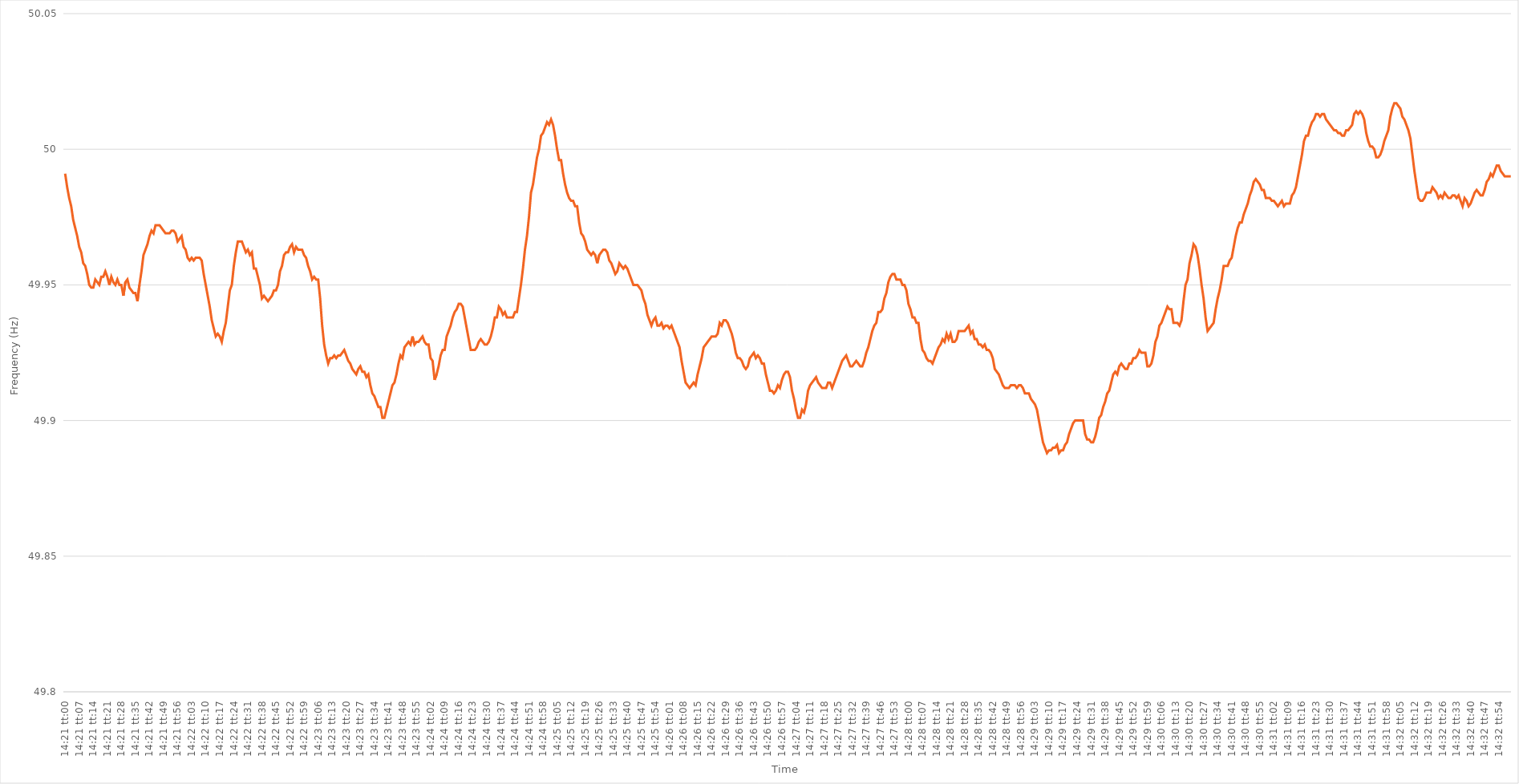
| Category | Series 0 |
|---|---|
| 0.5979166666666667 | 49.991 |
| 0.5979282407407408 | 49.986 |
| 0.5979398148148148 | 49.982 |
| 0.5979513888888889 | 49.979 |
| 0.5979629629629629 | 49.974 |
| 0.5979745370370371 | 49.971 |
| 0.5979861111111111 | 49.968 |
| 0.5979976851851853 | 49.964 |
| 0.5980092592592593 | 49.962 |
| 0.5980208333333333 | 49.958 |
| 0.5980324074074074 | 49.957 |
| 0.5980439814814814 | 49.954 |
| 0.5980555555555556 | 49.95 |
| 0.5980671296296296 | 49.949 |
| 0.5980787037037038 | 49.949 |
| 0.5980902777777778 | 49.952 |
| 0.5981018518518518 | 49.951 |
| 0.5981134259259259 | 49.95 |
| 0.598125 | 49.953 |
| 0.5981365740740741 | 49.953 |
| 0.5981481481481482 | 49.955 |
| 0.5981597222222222 | 49.953 |
| 0.5981712962962963 | 49.95 |
| 0.5981828703703703 | 49.953 |
| 0.5981944444444445 | 49.951 |
| 0.5982060185185185 | 49.95 |
| 0.5982175925925927 | 49.952 |
| 0.5982291666666667 | 49.95 |
| 0.5982407407407407 | 49.95 |
| 0.5982523148148148 | 49.946 |
| 0.5982638888888888 | 49.951 |
| 0.598275462962963 | 49.952 |
| 0.598287037037037 | 49.949 |
| 0.5982986111111112 | 49.948 |
| 0.5983101851851852 | 49.947 |
| 0.5983217592592592 | 49.947 |
| 0.5983333333333333 | 49.944 |
| 0.5983449074074074 | 49.95 |
| 0.5983564814814815 | 49.955 |
| 0.5983680555555556 | 49.961 |
| 0.5983796296296297 | 49.963 |
| 0.5983912037037037 | 49.965 |
| 0.5984027777777777 | 49.968 |
| 0.5984143518518519 | 49.97 |
| 0.5984259259259259 | 49.969 |
| 0.5984375000000001 | 49.972 |
| 0.5984490740740741 | 49.972 |
| 0.5984606481481481 | 49.972 |
| 0.5984722222222222 | 49.971 |
| 0.5984837962962963 | 49.97 |
| 0.5984953703703704 | 49.969 |
| 0.5985069444444444 | 49.969 |
| 0.5985185185185186 | 49.969 |
| 0.5985300925925926 | 49.97 |
| 0.5985416666666666 | 49.97 |
| 0.5985532407407407 | 49.969 |
| 0.5985648148148148 | 49.966 |
| 0.5985763888888889 | 49.967 |
| 0.598587962962963 | 49.968 |
| 0.598599537037037 | 49.964 |
| 0.5986111111111111 | 49.963 |
| 0.5986226851851851 | 49.96 |
| 0.5986342592592593 | 49.959 |
| 0.5986458333333333 | 49.96 |
| 0.5986574074074075 | 49.959 |
| 0.5986689814814815 | 49.96 |
| 0.5986805555555555 | 49.96 |
| 0.5986921296296296 | 49.96 |
| 0.5987037037037037 | 49.959 |
| 0.5987152777777778 | 49.954 |
| 0.5987268518518518 | 49.95 |
| 0.598738425925926 | 49.946 |
| 0.59875 | 49.942 |
| 0.598761574074074 | 49.937 |
| 0.5987731481481481 | 49.934 |
| 0.5987847222222222 | 49.931 |
| 0.5987962962962963 | 49.932 |
| 0.5988078703703704 | 49.931 |
| 0.5988194444444445 | 49.929 |
| 0.5988310185185185 | 49.933 |
| 0.5988425925925925 | 49.936 |
| 0.5988541666666667 | 49.942 |
| 0.5988657407407407 | 49.948 |
| 0.5988773148148149 | 49.95 |
| 0.5988888888888889 | 49.957 |
| 0.598900462962963 | 49.962 |
| 0.598912037037037 | 49.966 |
| 0.5989236111111111 | 49.966 |
| 0.5989351851851852 | 49.966 |
| 0.5989467592592593 | 49.964 |
| 0.5989583333333334 | 49.962 |
| 0.5989699074074074 | 49.963 |
| 0.5989814814814814 | 49.961 |
| 0.5989930555555555 | 49.962 |
| 0.5990046296296296 | 49.956 |
| 0.5990162037037037 | 49.956 |
| 0.5990277777777778 | 49.953 |
| 0.5990393518518519 | 49.95 |
| 0.5990509259259259 | 49.945 |
| 0.5990624999999999 | 49.946 |
| 0.5990740740740741 | 49.945 |
| 0.5990856481481481 | 49.944 |
| 0.5990972222222223 | 49.945 |
| 0.5991087962962963 | 49.946 |
| 0.5991203703703704 | 49.948 |
| 0.5991319444444444 | 49.948 |
| 0.5991435185185185 | 49.95 |
| 0.5991550925925926 | 49.955 |
| 0.5991666666666667 | 49.957 |
| 0.5991782407407408 | 49.961 |
| 0.5991898148148148 | 49.962 |
| 0.5992013888888889 | 49.962 |
| 0.5992129629629629 | 49.964 |
| 0.599224537037037 | 49.965 |
| 0.5992361111111111 | 49.962 |
| 0.5992476851851852 | 49.964 |
| 0.5992592592592593 | 49.963 |
| 0.5992708333333333 | 49.963 |
| 0.5992824074074073 | 49.963 |
| 0.5992939814814815 | 49.961 |
| 0.5993055555555555 | 49.96 |
| 0.5993171296296297 | 49.957 |
| 0.5993287037037037 | 49.955 |
| 0.5993402777777778 | 49.952 |
| 0.5993518518518518 | 49.953 |
| 0.599363425925926 | 49.952 |
| 0.599375 | 49.952 |
| 0.5993865740740741 | 49.945 |
| 0.5993981481481482 | 49.935 |
| 0.5994097222222222 | 49.928 |
| 0.5994212962962963 | 49.924 |
| 0.5994328703703703 | 49.921 |
| 0.5994444444444444 | 49.923 |
| 0.5994560185185185 | 49.923 |
| 0.5994675925925926 | 49.924 |
| 0.5994791666666667 | 49.923 |
| 0.5994907407407407 | 49.924 |
| 0.5995023148148148 | 49.924 |
| 0.5995138888888889 | 49.925 |
| 0.5995254629629629 | 49.926 |
| 0.5995370370370371 | 49.924 |
| 0.5995486111111111 | 49.922 |
| 0.5995601851851852 | 49.921 |
| 0.5995717592592592 | 49.919 |
| 0.5995833333333334 | 49.918 |
| 0.5995949074074074 | 49.917 |
| 0.5996064814814815 | 49.919 |
| 0.5996180555555556 | 49.92 |
| 0.5996296296296296 | 49.918 |
| 0.5996412037037037 | 49.918 |
| 0.5996527777777778 | 49.916 |
| 0.5996643518518519 | 49.917 |
| 0.599675925925926 | 49.913 |
| 0.5996875 | 49.91 |
| 0.5996990740740741 | 49.909 |
| 0.5997106481481481 | 49.907 |
| 0.5997222222222222 | 49.905 |
| 0.5997337962962963 | 49.905 |
| 0.5997453703703703 | 49.901 |
| 0.5997569444444445 | 49.901 |
| 0.5997685185185185 | 49.904 |
| 0.5997800925925926 | 49.907 |
| 0.5997916666666666 | 49.91 |
| 0.5998032407407408 | 49.913 |
| 0.5998148148148148 | 49.914 |
| 0.599826388888889 | 49.917 |
| 0.599837962962963 | 49.921 |
| 0.599849537037037 | 49.924 |
| 0.5998611111111111 | 49.923 |
| 0.5998726851851852 | 49.927 |
| 0.5998842592592593 | 49.928 |
| 0.5998958333333334 | 49.929 |
| 0.5999074074074074 | 49.928 |
| 0.5999189814814815 | 49.931 |
| 0.5999305555555555 | 49.928 |
| 0.5999421296296296 | 49.929 |
| 0.5999537037037037 | 49.929 |
| 0.5999652777777778 | 49.93 |
| 0.5999768518518519 | 49.931 |
| 0.5999884259259259 | 49.929 |
| 0.6 | 49.928 |
| 0.600011574074074 | 49.928 |
| 0.6000231481481482 | 49.923 |
| 0.6000347222222222 | 49.922 |
| 0.6000462962962964 | 49.915 |
| 0.6000578703703704 | 49.917 |
| 0.6000694444444444 | 49.92 |
| 0.6000810185185185 | 49.924 |
| 0.6000925925925926 | 49.926 |
| 0.6001041666666667 | 49.926 |
| 0.6001157407407408 | 49.931 |
| 0.6001273148148148 | 49.933 |
| 0.6001388888888889 | 49.935 |
| 0.6001504629629629 | 49.938 |
| 0.600162037037037 | 49.94 |
| 0.6001736111111111 | 49.941 |
| 0.6001851851851852 | 49.943 |
| 0.6001967592592593 | 49.943 |
| 0.6002083333333333 | 49.942 |
| 0.6002199074074074 | 49.938 |
| 0.6002314814814814 | 49.934 |
| 0.6002430555555556 | 49.93 |
| 0.6002546296296296 | 49.926 |
| 0.6002662037037038 | 49.926 |
| 0.6002777777777778 | 49.926 |
| 0.6002893518518518 | 49.927 |
| 0.6003009259259259 | 49.929 |
| 0.6003125 | 49.93 |
| 0.6003240740740741 | 49.929 |
| 0.6003356481481482 | 49.928 |
| 0.6003472222222223 | 49.928 |
| 0.6003587962962963 | 49.929 |
| 0.6003703703703703 | 49.931 |
| 0.6003819444444445 | 49.934 |
| 0.6003935185185185 | 49.938 |
| 0.6004050925925926 | 49.938 |
| 0.6004166666666667 | 49.942 |
| 0.6004282407407407 | 49.941 |
| 0.6004398148148148 | 49.939 |
| 0.6004513888888888 | 49.94 |
| 0.600462962962963 | 49.938 |
| 0.600474537037037 | 49.938 |
| 0.6004861111111112 | 49.938 |
| 0.6004976851851852 | 49.938 |
| 0.6005092592592592 | 49.94 |
| 0.6005208333333333 | 49.94 |
| 0.6005324074074074 | 49.945 |
| 0.6005439814814815 | 49.95 |
| 0.6005555555555556 | 49.956 |
| 0.6005671296296297 | 49.963 |
| 0.6005787037037037 | 49.968 |
| 0.6005902777777777 | 49.975 |
| 0.6006018518518519 | 49.984 |
| 0.6006134259259259 | 49.987 |
| 0.600625 | 49.992 |
| 0.6006365740740741 | 49.997 |
| 0.6006481481481482 | 50 |
| 0.6006597222222222 | 50.005 |
| 0.6006712962962962 | 50.006 |
| 0.6006828703703704 | 50.008 |
| 0.6006944444444444 | 50.01 |
| 0.6007060185185186 | 50.009 |
| 0.6007175925925926 | 50.011 |
| 0.6007291666666666 | 50.009 |
| 0.6007407407407407 | 50.005 |
| 0.6007523148148148 | 50 |
| 0.6007638888888889 | 49.996 |
| 0.600775462962963 | 49.996 |
| 0.6007870370370371 | 49.991 |
| 0.6007986111111111 | 49.987 |
| 0.6008101851851851 | 49.984 |
| 0.6008217592592593 | 49.982 |
| 0.6008333333333333 | 49.981 |
| 0.6008449074074074 | 49.981 |
| 0.6008564814814815 | 49.979 |
| 0.6008680555555556 | 49.979 |
| 0.6008796296296296 | 49.973 |
| 0.6008912037037036 | 49.969 |
| 0.6009027777777778 | 49.968 |
| 0.6009143518518518 | 49.966 |
| 0.600925925925926 | 49.963 |
| 0.6009375 | 49.962 |
| 0.600949074074074 | 49.961 |
| 0.6009606481481481 | 49.962 |
| 0.6009722222222222 | 49.961 |
| 0.6009837962962963 | 49.958 |
| 0.6009953703703704 | 49.961 |
| 0.6010069444444445 | 49.962 |
| 0.6010185185185185 | 49.963 |
| 0.6010300925925925 | 49.963 |
| 0.6010416666666667 | 49.962 |
| 0.6010532407407407 | 49.959 |
| 0.6010648148148149 | 49.958 |
| 0.6010763888888889 | 49.956 |
| 0.601087962962963 | 49.954 |
| 0.601099537037037 | 49.955 |
| 0.601111111111111 | 49.958 |
| 0.6011226851851852 | 49.957 |
| 0.6011342592592592 | 49.956 |
| 0.6011458333333334 | 49.957 |
| 0.6011574074074074 | 49.956 |
| 0.6011689814814815 | 49.954 |
| 0.6011805555555555 | 49.952 |
| 0.6011921296296296 | 49.95 |
| 0.6012037037037037 | 49.95 |
| 0.6012152777777778 | 49.95 |
| 0.6012268518518519 | 49.949 |
| 0.6012384259259259 | 49.948 |
| 0.60125 | 49.945 |
| 0.6012615740740741 | 49.943 |
| 0.6012731481481481 | 49.939 |
| 0.6012847222222223 | 49.937 |
| 0.6012962962962963 | 49.935 |
| 0.6013078703703704 | 49.937 |
| 0.6013194444444444 | 49.938 |
| 0.6013310185185184 | 49.935 |
| 0.6013425925925926 | 49.935 |
| 0.6013541666666666 | 49.936 |
| 0.6013657407407408 | 49.934 |
| 0.6013773148148148 | 49.935 |
| 0.6013888888888889 | 49.935 |
| 0.6014004629629629 | 49.934 |
| 0.601412037037037 | 49.935 |
| 0.6014236111111111 | 49.933 |
| 0.6014351851851852 | 49.931 |
| 0.6014467592592593 | 49.929 |
| 0.6014583333333333 | 49.927 |
| 0.6014699074074074 | 49.922 |
| 0.6014814814814815 | 49.918 |
| 0.6014930555555555 | 49.914 |
| 0.6015046296296297 | 49.913 |
| 0.6015162037037037 | 49.912 |
| 0.6015277777777778 | 49.913 |
| 0.6015393518518518 | 49.914 |
| 0.601550925925926 | 49.913 |
| 0.6015625 | 49.917 |
| 0.601574074074074 | 49.92 |
| 0.6015856481481482 | 49.923 |
| 0.6015972222222222 | 49.927 |
| 0.6016087962962963 | 49.928 |
| 0.6016203703703703 | 49.929 |
| 0.6016319444444445 | 49.93 |
| 0.6016435185185185 | 49.931 |
| 0.6016550925925926 | 49.931 |
| 0.6016666666666667 | 49.931 |
| 0.6016782407407407 | 49.932 |
| 0.6016898148148148 | 49.936 |
| 0.6017013888888889 | 49.935 |
| 0.601712962962963 | 49.937 |
| 0.6017245370370371 | 49.937 |
| 0.6017361111111111 | 49.936 |
| 0.6017476851851852 | 49.934 |
| 0.6017592592592592 | 49.932 |
| 0.6017708333333334 | 49.929 |
| 0.6017824074074074 | 49.925 |
| 0.6017939814814816 | 49.923 |
| 0.6018055555555556 | 49.923 |
| 0.6018171296296296 | 49.922 |
| 0.6018287037037037 | 49.92 |
| 0.6018402777777777 | 49.919 |
| 0.6018518518518519 | 49.92 |
| 0.6018634259259259 | 49.923 |
| 0.601875 | 49.924 |
| 0.6018865740740741 | 49.925 |
| 0.6018981481481481 | 49.923 |
| 0.6019097222222222 | 49.924 |
| 0.6019212962962963 | 49.923 |
| 0.6019328703703704 | 49.921 |
| 0.6019444444444445 | 49.921 |
| 0.6019560185185185 | 49.917 |
| 0.6019675925925926 | 49.914 |
| 0.6019791666666666 | 49.911 |
| 0.6019907407407408 | 49.911 |
| 0.6020023148148148 | 49.91 |
| 0.602013888888889 | 49.911 |
| 0.602025462962963 | 49.913 |
| 0.602037037037037 | 49.912 |
| 0.6020486111111111 | 49.915 |
| 0.6020601851851851 | 49.917 |
| 0.6020717592592593 | 49.918 |
| 0.6020833333333333 | 49.918 |
| 0.6020949074074075 | 49.916 |
| 0.6021064814814815 | 49.911 |
| 0.6021180555555555 | 49.908 |
| 0.6021296296296296 | 49.904 |
| 0.6021412037037037 | 49.901 |
| 0.6021527777777778 | 49.901 |
| 0.6021643518518519 | 49.904 |
| 0.602175925925926 | 49.903 |
| 0.6021875 | 49.906 |
| 0.602199074074074 | 49.911 |
| 0.6022106481481482 | 49.913 |
| 0.6022222222222222 | 49.914 |
| 0.6022337962962964 | 49.915 |
| 0.6022453703703704 | 49.916 |
| 0.6022569444444444 | 49.914 |
| 0.6022685185185185 | 49.913 |
| 0.6022800925925926 | 49.912 |
| 0.6022916666666667 | 49.912 |
| 0.6023032407407407 | 49.912 |
| 0.6023148148148149 | 49.914 |
| 0.6023263888888889 | 49.914 |
| 0.6023379629629629 | 49.912 |
| 0.602349537037037 | 49.914 |
| 0.6023611111111111 | 49.916 |
| 0.6023726851851852 | 49.918 |
| 0.6023842592592593 | 49.92 |
| 0.6023958333333334 | 49.922 |
| 0.6024074074074074 | 49.923 |
| 0.6024189814814814 | 49.924 |
| 0.6024305555555556 | 49.922 |
| 0.6024421296296296 | 49.92 |
| 0.6024537037037038 | 49.92 |
| 0.6024652777777778 | 49.921 |
| 0.6024768518518518 | 49.922 |
| 0.6024884259259259 | 49.921 |
| 0.6025 | 49.92 |
| 0.6025115740740741 | 49.92 |
| 0.6025231481481481 | 49.922 |
| 0.6025347222222223 | 49.925 |
| 0.6025462962962963 | 49.927 |
| 0.6025578703703703 | 49.93 |
| 0.6025694444444444 | 49.933 |
| 0.6025810185185185 | 49.935 |
| 0.6025925925925926 | 49.936 |
| 0.6026041666666667 | 49.94 |
| 0.6026157407407408 | 49.94 |
| 0.6026273148148148 | 49.941 |
| 0.6026388888888888 | 49.945 |
| 0.602650462962963 | 49.947 |
| 0.602662037037037 | 49.951 |
| 0.6026736111111112 | 49.953 |
| 0.6026851851851852 | 49.954 |
| 0.6026967592592593 | 49.954 |
| 0.6027083333333333 | 49.952 |
| 0.6027199074074074 | 49.952 |
| 0.6027314814814815 | 49.952 |
| 0.6027430555555555 | 49.95 |
| 0.6027546296296297 | 49.95 |
| 0.6027662037037037 | 49.948 |
| 0.6027777777777777 | 49.943 |
| 0.6027893518518518 | 49.941 |
| 0.6028009259259259 | 49.938 |
| 0.6028125 | 49.938 |
| 0.6028240740740741 | 49.936 |
| 0.6028356481481482 | 49.936 |
| 0.6028472222222222 | 49.93 |
| 0.6028587962962962 | 49.926 |
| 0.6028703703703704 | 49.925 |
| 0.6028819444444444 | 49.923 |
| 0.6028935185185186 | 49.922 |
| 0.6029050925925926 | 49.922 |
| 0.6029166666666667 | 49.921 |
| 0.6029282407407407 | 49.923 |
| 0.6029398148148148 | 49.925 |
| 0.6029513888888889 | 49.927 |
| 0.602962962962963 | 49.928 |
| 0.6029745370370371 | 49.93 |
| 0.6029861111111111 | 49.929 |
| 0.6029976851851852 | 49.932 |
| 0.6030092592592592 | 49.93 |
| 0.6030208333333333 | 49.932 |
| 0.6030324074074074 | 49.929 |
| 0.6030439814814815 | 49.929 |
| 0.6030555555555556 | 49.93 |
| 0.6030671296296296 | 49.933 |
| 0.6030787037037036 | 49.933 |
| 0.6030902777777778 | 49.933 |
| 0.6031018518518518 | 49.933 |
| 0.603113425925926 | 49.934 |
| 0.603125 | 49.935 |
| 0.6031365740740741 | 49.932 |
| 0.6031481481481481 | 49.933 |
| 0.6031597222222222 | 49.93 |
| 0.6031712962962963 | 49.93 |
| 0.6031828703703704 | 49.928 |
| 0.6031944444444445 | 49.928 |
| 0.6032060185185185 | 49.927 |
| 0.6032175925925926 | 49.928 |
| 0.6032291666666666 | 49.926 |
| 0.6032407407407407 | 49.926 |
| 0.6032523148148148 | 49.925 |
| 0.6032638888888889 | 49.923 |
| 0.603275462962963 | 49.919 |
| 0.603287037037037 | 49.918 |
| 0.603298611111111 | 49.917 |
| 0.6033101851851852 | 49.915 |
| 0.6033217592592592 | 49.913 |
| 0.6033333333333334 | 49.912 |
| 0.6033449074074074 | 49.912 |
| 0.6033564814814815 | 49.912 |
| 0.6033680555555555 | 49.913 |
| 0.6033796296296297 | 49.913 |
| 0.6033912037037037 | 49.913 |
| 0.6034027777777778 | 49.912 |
| 0.6034143518518519 | 49.913 |
| 0.6034259259259259 | 49.913 |
| 0.6034375 | 49.912 |
| 0.603449074074074 | 49.91 |
| 0.6034606481481481 | 49.91 |
| 0.6034722222222222 | 49.91 |
| 0.6034837962962963 | 49.908 |
| 0.6034953703703704 | 49.907 |
| 0.6035069444444444 | 49.906 |
| 0.6035185185185185 | 49.904 |
| 0.6035300925925926 | 49.9 |
| 0.6035416666666666 | 49.896 |
| 0.6035532407407408 | 49.892 |
| 0.6035648148148148 | 49.89 |
| 0.6035763888888889 | 49.888 |
| 0.6035879629629629 | 49.889 |
| 0.6035995370370371 | 49.889 |
| 0.6036111111111111 | 49.89 |
| 0.6036226851851852 | 49.89 |
| 0.6036342592592593 | 49.891 |
| 0.6036458333333333 | 49.888 |
| 0.6036574074074074 | 49.889 |
| 0.6036689814814815 | 49.889 |
| 0.6036805555555556 | 49.891 |
| 0.6036921296296297 | 49.892 |
| 0.6037037037037037 | 49.895 |
| 0.6037152777777778 | 49.897 |
| 0.6037268518518518 | 49.899 |
| 0.6037384259259259 | 49.9 |
| 0.60375 | 49.9 |
| 0.603761574074074 | 49.9 |
| 0.6037731481481482 | 49.9 |
| 0.6037847222222222 | 49.9 |
| 0.6037962962962963 | 49.895 |
| 0.6038078703703703 | 49.893 |
| 0.6038194444444445 | 49.893 |
| 0.6038310185185185 | 49.892 |
| 0.6038425925925927 | 49.892 |
| 0.6038541666666667 | 49.894 |
| 0.6038657407407407 | 49.897 |
| 0.6038773148148148 | 49.901 |
| 0.6038888888888889 | 49.902 |
| 0.603900462962963 | 49.905 |
| 0.6039120370370371 | 49.907 |
| 0.6039236111111111 | 49.91 |
| 0.6039351851851852 | 49.911 |
| 0.6039467592592592 | 49.914 |
| 0.6039583333333333 | 49.917 |
| 0.6039699074074074 | 49.918 |
| 0.6039814814814815 | 49.917 |
| 0.6039930555555556 | 49.92 |
| 0.6040046296296296 | 49.921 |
| 0.6040162037037037 | 49.92 |
| 0.6040277777777777 | 49.919 |
| 0.6040393518518519 | 49.919 |
| 0.6040509259259259 | 49.921 |
| 0.6040625000000001 | 49.921 |
| 0.6040740740740741 | 49.923 |
| 0.6040856481481481 | 49.923 |
| 0.6040972222222222 | 49.924 |
| 0.6041087962962963 | 49.926 |
| 0.6041203703703704 | 49.925 |
| 0.6041319444444445 | 49.925 |
| 0.6041435185185186 | 49.925 |
| 0.6041550925925926 | 49.92 |
| 0.6041666666666666 | 49.92 |
| 0.6041782407407407 | 49.921 |
| 0.6041898148148148 | 49.924 |
| 0.6042013888888889 | 49.929 |
| 0.604212962962963 | 49.931 |
| 0.604224537037037 | 49.935 |
| 0.6042361111111111 | 49.936 |
| 0.6042476851851851 | 49.938 |
| 0.6042592592592593 | 49.94 |
| 0.6042708333333333 | 49.942 |
| 0.6042824074074075 | 49.941 |
| 0.6042939814814815 | 49.941 |
| 0.6043055555555555 | 49.936 |
| 0.6043171296296296 | 49.936 |
| 0.6043287037037037 | 49.936 |
| 0.6043402777777778 | 49.935 |
| 0.6043518518518519 | 49.937 |
| 0.604363425925926 | 49.944 |
| 0.604375 | 49.95 |
| 0.604386574074074 | 49.952 |
| 0.6043981481481482 | 49.958 |
| 0.6044097222222222 | 49.961 |
| 0.6044212962962963 | 49.965 |
| 0.6044328703703704 | 49.964 |
| 0.6044444444444445 | 49.961 |
| 0.6044560185185185 | 49.956 |
| 0.6044675925925925 | 49.95 |
| 0.6044791666666667 | 49.945 |
| 0.6044907407407407 | 49.938 |
| 0.6045023148148149 | 49.933 |
| 0.6045138888888889 | 49.934 |
| 0.604525462962963 | 49.935 |
| 0.604537037037037 | 49.936 |
| 0.6045486111111111 | 49.941 |
| 0.6045601851851852 | 49.945 |
| 0.6045717592592593 | 49.948 |
| 0.6045833333333334 | 49.952 |
| 0.6045949074074074 | 49.957 |
| 0.6046064814814814 | 49.957 |
| 0.6046180555555556 | 49.957 |
| 0.6046296296296296 | 49.959 |
| 0.6046412037037037 | 49.96 |
| 0.6046527777777778 | 49.964 |
| 0.6046643518518519 | 49.968 |
| 0.6046759259259259 | 49.971 |
| 0.6046874999999999 | 49.973 |
| 0.6046990740740741 | 49.973 |
| 0.6047106481481481 | 49.976 |
| 0.6047222222222223 | 49.978 |
| 0.6047337962962963 | 49.98 |
| 0.6047453703703703 | 49.983 |
| 0.6047569444444444 | 49.985 |
| 0.6047685185185185 | 49.988 |
| 0.6047800925925926 | 49.989 |
| 0.6047916666666667 | 49.988 |
| 0.6048032407407408 | 49.987 |
| 0.6048148148148148 | 49.985 |
| 0.6048263888888888 | 49.985 |
| 0.604837962962963 | 49.982 |
| 0.604849537037037 | 49.982 |
| 0.6048611111111112 | 49.982 |
| 0.6048726851851852 | 49.981 |
| 0.6048842592592593 | 49.981 |
| 0.6048958333333333 | 49.98 |
| 0.6049074074074073 | 49.979 |
| 0.6049189814814815 | 49.98 |
| 0.6049305555555555 | 49.981 |
| 0.6049421296296297 | 49.979 |
| 0.6049537037037037 | 49.98 |
| 0.6049652777777778 | 49.98 |
| 0.6049768518518518 | 49.98 |
| 0.6049884259259259 | 49.983 |
| 0.605 | 49.984 |
| 0.6050115740740741 | 49.986 |
| 0.6050231481481482 | 49.99 |
| 0.6050347222222222 | 49.994 |
| 0.6050462962962962 | 49.998 |
| 0.6050578703703704 | 50.003 |
| 0.6050694444444444 | 50.005 |
| 0.6050810185185186 | 50.005 |
| 0.6050925925925926 | 50.008 |
| 0.6051041666666667 | 50.01 |
| 0.6051157407407407 | 50.011 |
| 0.6051273148148147 | 50.013 |
| 0.6051388888888889 | 50.013 |
| 0.6051504629629629 | 50.012 |
| 0.6051620370370371 | 50.013 |
| 0.6051736111111111 | 50.013 |
| 0.6051851851851852 | 50.011 |
| 0.6051967592592592 | 50.01 |
| 0.6052083333333333 | 50.009 |
| 0.6052199074074074 | 50.008 |
| 0.6052314814814815 | 50.007 |
| 0.6052430555555556 | 50.007 |
| 0.6052546296296296 | 50.006 |
| 0.6052662037037037 | 50.006 |
| 0.6052777777777778 | 50.005 |
| 0.6052893518518518 | 50.005 |
| 0.605300925925926 | 50.007 |
| 0.6053125 | 50.007 |
| 0.6053240740740741 | 50.008 |
| 0.6053356481481481 | 50.009 |
| 0.6053472222222221 | 50.013 |
| 0.6053587962962963 | 50.014 |
| 0.6053703703703703 | 50.013 |
| 0.6053819444444445 | 50.014 |
| 0.6053935185185185 | 50.013 |
| 0.6054050925925926 | 50.011 |
| 0.6054166666666666 | 50.006 |
| 0.6054282407407408 | 50.003 |
| 0.6054398148148148 | 50.001 |
| 0.6054513888888889 | 50.001 |
| 0.605462962962963 | 50 |
| 0.605474537037037 | 49.997 |
| 0.6054861111111111 | 49.997 |
| 0.6054976851851852 | 49.998 |
| 0.6055092592592592 | 50 |
| 0.6055208333333334 | 50.003 |
| 0.6055324074074074 | 50.005 |
| 0.6055439814814815 | 50.007 |
| 0.6055555555555555 | 50.012 |
| 0.6055671296296297 | 50.015 |
| 0.6055787037037037 | 50.017 |
| 0.6055902777777777 | 50.017 |
| 0.6056018518518519 | 50.016 |
| 0.6056134259259259 | 50.015 |
| 0.605625 | 50.012 |
| 0.605636574074074 | 50.011 |
| 0.6056481481481482 | 50.009 |
| 0.6056597222222222 | 50.007 |
| 0.6056712962962963 | 50.004 |
| 0.6056828703703704 | 49.998 |
| 0.6056944444444444 | 49.992 |
| 0.6057060185185185 | 49.987 |
| 0.6057175925925926 | 49.982 |
| 0.6057291666666667 | 49.981 |
| 0.6057407407407408 | 49.981 |
| 0.6057523148148148 | 49.982 |
| 0.6057638888888889 | 49.984 |
| 0.6057754629629629 | 49.984 |
| 0.6057870370370371 | 49.984 |
| 0.6057986111111111 | 49.986 |
| 0.6058101851851853 | 49.985 |
| 0.6058217592592593 | 49.984 |
| 0.6058333333333333 | 49.982 |
| 0.6058449074074074 | 49.983 |
| 0.6058564814814814 | 49.982 |
| 0.6058680555555556 | 49.984 |
| 0.6058796296296296 | 49.983 |
| 0.6058912037037038 | 49.982 |
| 0.6059027777777778 | 49.982 |
| 0.6059143518518518 | 49.983 |
| 0.6059259259259259 | 49.983 |
| 0.6059375 | 49.982 |
| 0.6059490740740741 | 49.983 |
| 0.6059606481481482 | 49.981 |
| 0.6059722222222222 | 49.979 |
| 0.6059837962962963 | 49.982 |
| 0.6059953703703703 | 49.981 |
| 0.6060069444444445 | 49.979 |
| 0.6060185185185185 | 49.98 |
| 0.6060300925925927 | 49.982 |
| 0.6060416666666667 | 49.984 |
| 0.6060532407407407 | 49.985 |
| 0.6060648148148148 | 49.984 |
| 0.6060763888888888 | 49.983 |
| 0.606087962962963 | 49.983 |
| 0.606099537037037 | 49.985 |
| 0.6061111111111112 | 49.988 |
| 0.6061226851851852 | 49.989 |
| 0.6061342592592592 | 49.991 |
| 0.6061458333333333 | 49.99 |
| 0.6061574074074074 | 49.992 |
| 0.6061689814814815 | 49.994 |
| 0.6061805555555556 | 49.994 |
| 0.6061921296296297 | 49.992 |
| 0.6062037037037037 | 49.991 |
| 0.6062152777777777 | 49.99 |
| 0.6062268518518519 | 49.99 |
| 0.6062384259259259 | 49.99 |
| 0.6062500000000001 | 49.99 |